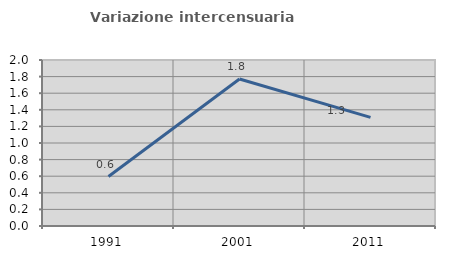
| Category | Variazione intercensuaria annua |
|---|---|
| 1991.0 | 0.596 |
| 2001.0 | 1.771 |
| 2011.0 | 1.309 |